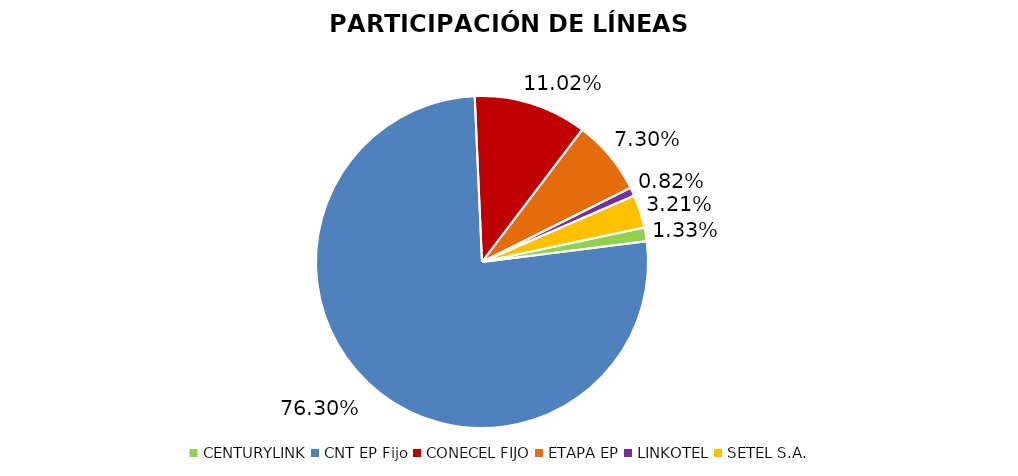
| Category | Participación en el Mercado |
|---|---|
| CENTURYLINK | 0.013 |
| CNT EP Fijo | 0.763 |
| CONECEL FIJO | 0.11 |
| ETAPA EP | 0.073 |
| LINKOTEL | 0.008 |
| SETEL S.A. | 0.032 |